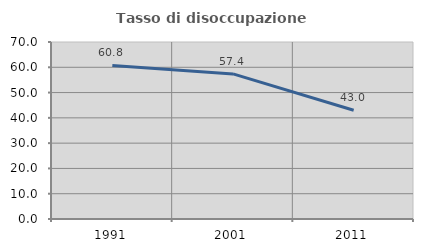
| Category | Tasso di disoccupazione giovanile  |
|---|---|
| 1991.0 | 60.751 |
| 2001.0 | 57.377 |
| 2011.0 | 43.011 |